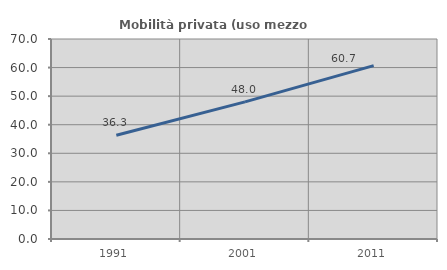
| Category | Mobilità privata (uso mezzo privato) |
|---|---|
| 1991.0 | 36.31 |
| 2001.0 | 47.982 |
| 2011.0 | 60.68 |